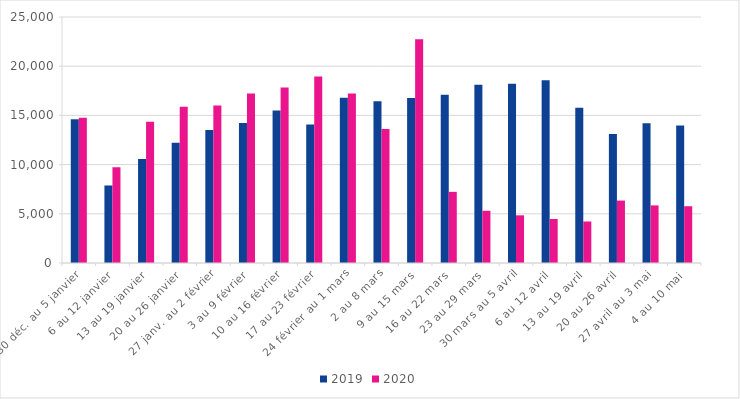
| Category | 2019 | 2020 |
|---|---|---|
| 30 déc. au 5 janvier | 14597 | 14758 |
| 6 au 12 janvier | 7879 | 9721 |
| 13 au 19 janvier | 10570 | 14356 |
| 20 au 26 janvier | 12222 | 15873 |
| 27 janv. au 2 février | 13510 | 16009 |
| 3 au 9 février | 14232 | 17227 |
| 10 au 16 février | 15499 | 17823 |
| 17 au 23 février | 14063 | 18961 |
| 24 février au 1 mars | 16783 | 17226 |
| 2 au 8 mars | 16432 | 13610 |
| 9 au 15 mars | 16765 | 22742 |
| 16 au 22 mars | 17107 | 7230 |
| 23 au 29 mars | 18126 | 5308 |
| 30 mars au 5 avril | 18204 | 4846 |
| 6 au 12 avril | 18560 | 4474 |
| 13 au 19 avril | 15788 | 4220 |
| 20 au 26 avril | 13099 | 6344 |
| 27 avril au 3 mai | 14207 | 5855 |
| 4 au 10 mai | 13969 | 5766 |